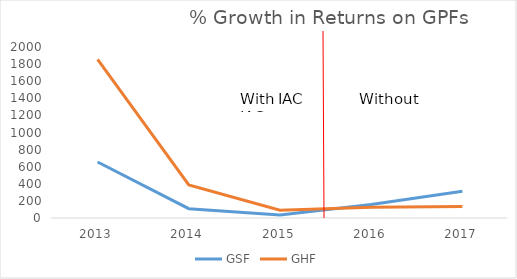
| Category | GSF | GHF |
|---|---|---|
| 2013.0 | 654.927 | 1855.666 |
| 2014.0 | 109.271 | 386.611 |
| 2015.0 | 34.718 | 91.824 |
| 2016.0 | 157.932 | 124.309 |
| 2017.0 | 311.872 | 135.256 |